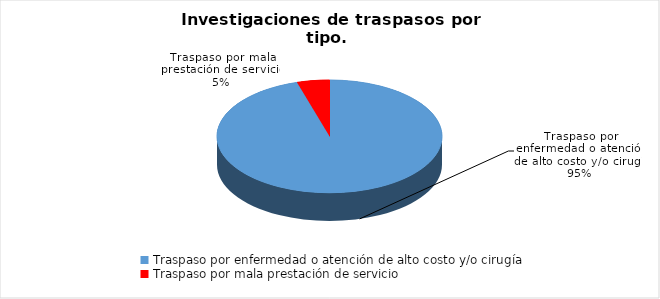
| Category | Series 0 |
|---|---|
| Traspaso por enfermedad o atención de alto costo y/o cirugía | 246 |
| Traspaso por mala prestación de servicio | 12 |